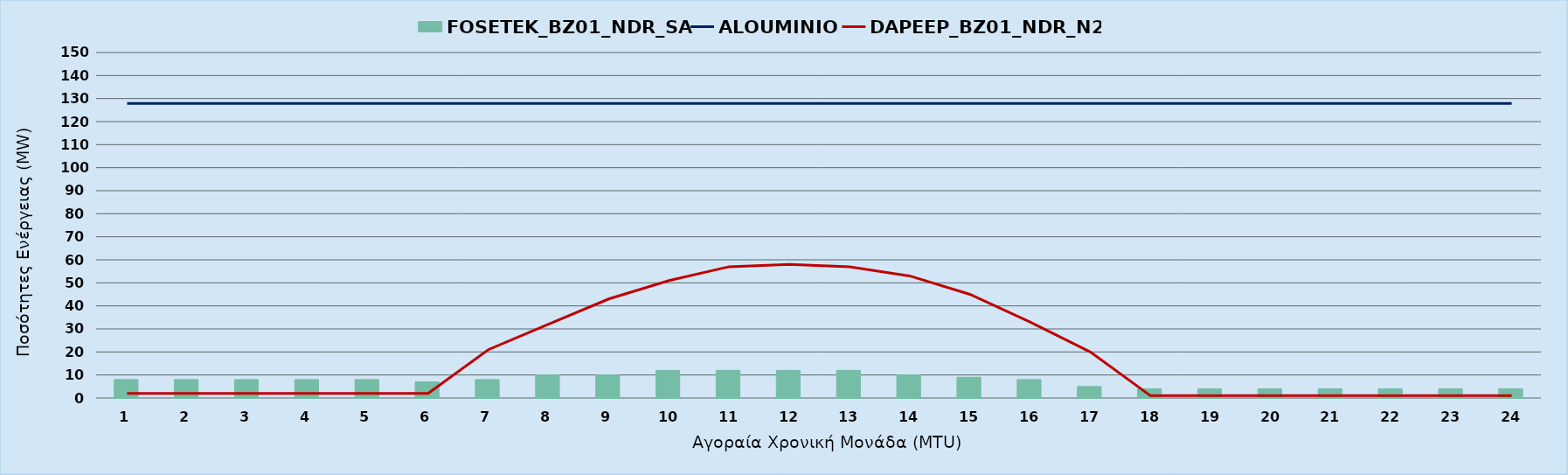
| Category | FOSETEK_BZ01_NDR_SA |
|---|---|
| 0 | 8 |
| 1 | 8 |
| 2 | 8 |
| 3 | 8 |
| 4 | 8 |
| 5 | 7 |
| 6 | 8 |
| 7 | 10 |
| 8 | 10 |
| 9 | 12 |
| 10 | 12 |
| 11 | 12 |
| 12 | 12 |
| 13 | 10 |
| 14 | 9 |
| 15 | 8 |
| 16 | 5 |
| 17 | 4 |
| 18 | 4 |
| 19 | 4 |
| 20 | 4 |
| 21 | 4 |
| 22 | 4 |
| 23 | 4 |